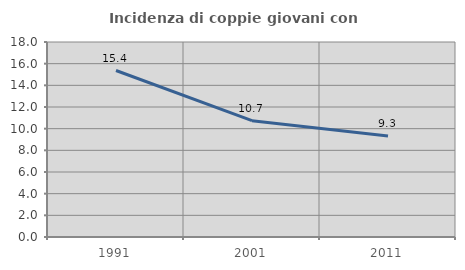
| Category | Incidenza di coppie giovani con figli |
|---|---|
| 1991.0 | 15.367 |
| 2001.0 | 10.741 |
| 2011.0 | 9.333 |